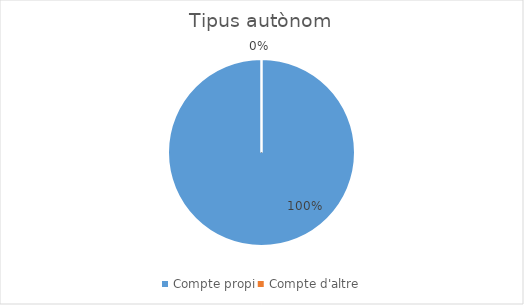
| Category | Series 0 |
|---|---|
| Compte propi | 2 |
| Compte d'altre | 0 |